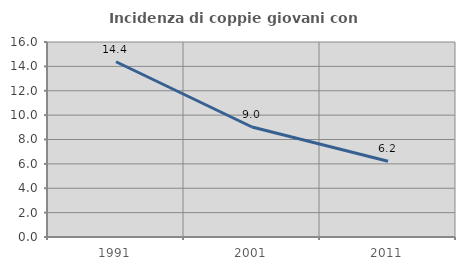
| Category | Incidenza di coppie giovani con figli |
|---|---|
| 1991.0 | 14.38 |
| 2001.0 | 9.026 |
| 2011.0 | 6.21 |